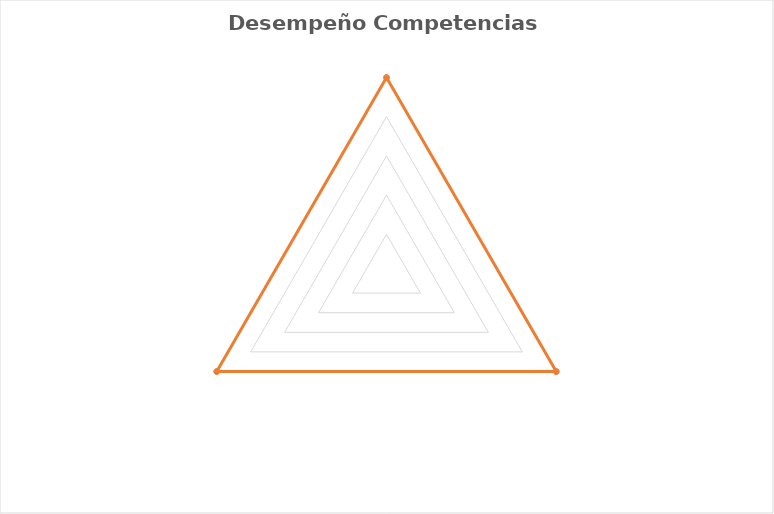
| Category | Series 0 |
|---|---|
| ·         Liderazgo | 100 |
| ·         Iniciativa | 100 |
| ·         Orientación al logro | 100 |